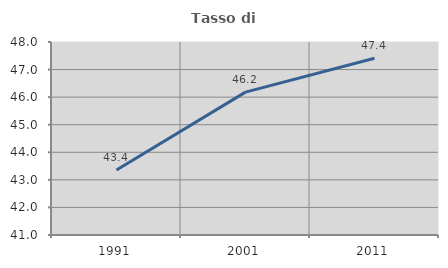
| Category | Tasso di occupazione   |
|---|---|
| 1991.0 | 43.36 |
| 2001.0 | 46.181 |
| 2011.0 | 47.411 |